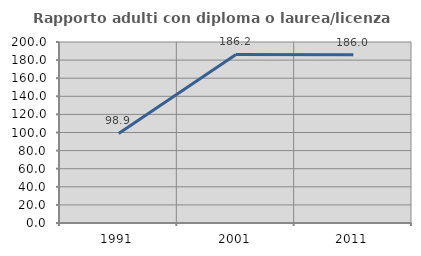
| Category | Rapporto adulti con diploma o laurea/licenza media  |
|---|---|
| 1991.0 | 98.947 |
| 2001.0 | 186.19 |
| 2011.0 | 186 |